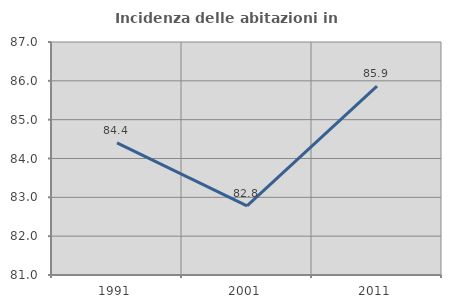
| Category | Incidenza delle abitazioni in proprietà  |
|---|---|
| 1991.0 | 84.401 |
| 2001.0 | 82.781 |
| 2011.0 | 85.866 |